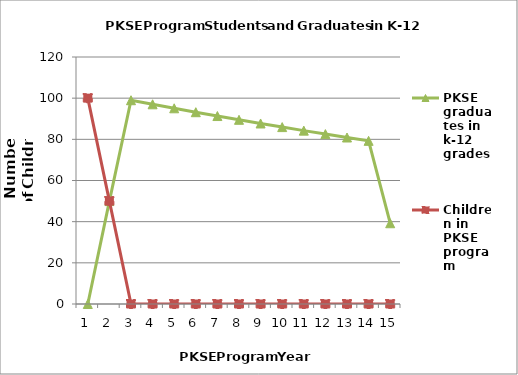
| Category | PKSE graduates in k-12 grades | Children in PKSE program |
|---|---|---|
| 1.0 | 0 | 100 |
| 2.0 | 50 | 50 |
| 3.0 | 99 | 0 |
| 4.0 | 97.02 | 0 |
| 5.0 | 95.08 | 0 |
| 6.0 | 93.178 | 0 |
| 7.0 | 91.314 | 0 |
| 8.0 | 89.488 | 0 |
| 9.0 | 87.698 | 0 |
| 10.0 | 85.944 | 0 |
| 11.0 | 84.226 | 0 |
| 12.0 | 82.541 | 0 |
| 13.0 | 80.89 | 0 |
| 14.0 | 79.272 | 0 |
| 15.0 | 39.236 | 0 |